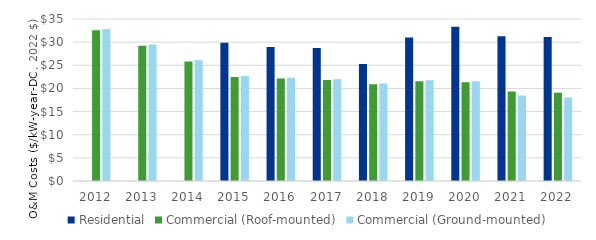
| Category | Residential | Commercial (Roof-mounted) | Commercial (Ground-mounted) |
|---|---|---|---|
| 2012.0 | 0 | 32.584 | 32.865 |
| 2013.0 | 0 | 29.213 | 29.465 |
| 2014.0 | 0 | 25.842 | 26.065 |
| 2015.0 | 29.86 | 22.472 | 22.665 |
| 2016.0 | 28.941 | 22.135 | 22.325 |
| 2017.0 | 28.711 | 21.798 | 21.986 |
| 2018.0 | 25.266 | 20.899 | 21.079 |
| 2019.0 | 31.008 | 21.573 | 21.759 |
| 2020.0 | 33.305 | 21.348 | 21.532 |
| 2021.0 | 31.28 | 19.349 | 18.464 |
| 2022.0 | 31.12 | 19.06 | 18.03 |